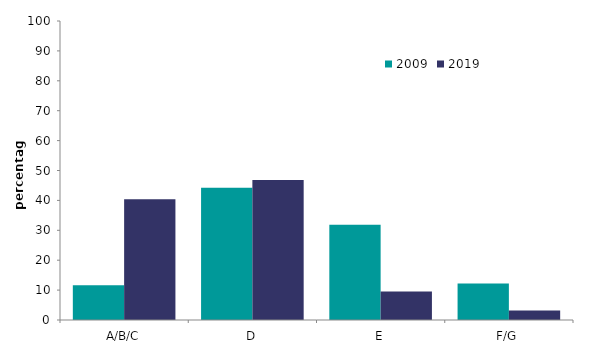
| Category | 2009 | 2019 |
|---|---|---|
| A/B/C | 11.617 | 40.362 |
| D | 44.26 | 46.863 |
| E | 31.892 | 9.563 |
| F/G | 12.23 | 3.211 |